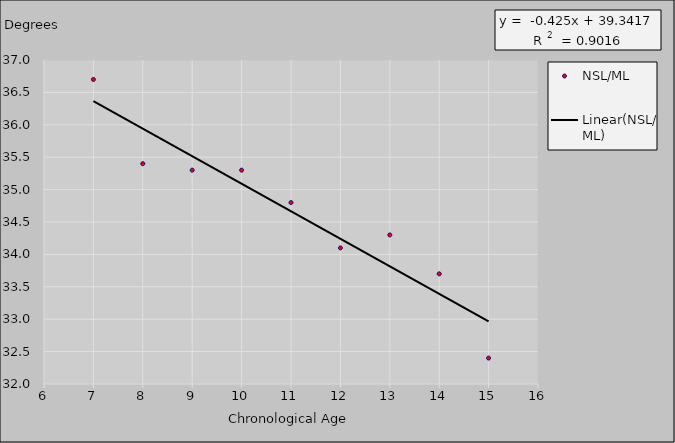
| Category | NSL/ML |
|---|---|
| 7.0 | 36.7 |
| 8.0 | 35.4 |
| 9.0 | 35.3 |
| 10.0 | 35.3 |
| 11.0 | 34.8 |
| 12.0 | 34.1 |
| 13.0 | 34.3 |
| 14.0 | 33.7 |
| 15.0 | 32.4 |